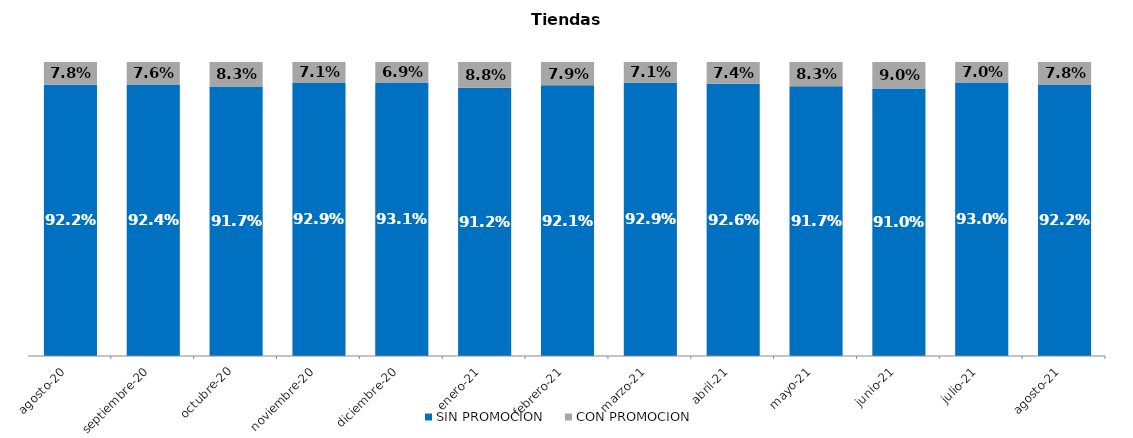
| Category | SIN PROMOCION   | CON PROMOCION   |
|---|---|---|
| 2020-08-01 | 0.922 | 0.078 |
| 2020-09-01 | 0.924 | 0.076 |
| 2020-10-01 | 0.917 | 0.083 |
| 2020-11-01 | 0.929 | 0.071 |
| 2020-12-01 | 0.931 | 0.069 |
| 2021-01-01 | 0.912 | 0.088 |
| 2021-02-01 | 0.921 | 0.079 |
| 2021-03-01 | 0.929 | 0.071 |
| 2021-04-01 | 0.926 | 0.074 |
| 2021-05-01 | 0.917 | 0.083 |
| 2021-06-01 | 0.91 | 0.09 |
| 2021-07-01 | 0.93 | 0.07 |
| 2021-08-01 | 0.922 | 0.078 |